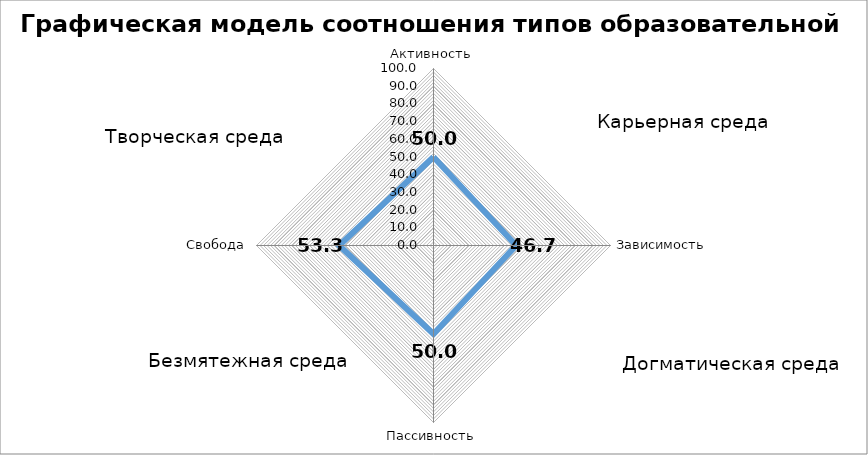
| Category | Графическая модель соотношения типов образовательной среды |
|---|---|
| Активность | 50 |
| Зависимость | 46.667 |
| Пассивность | 50 |
| Свобода | 53.333 |